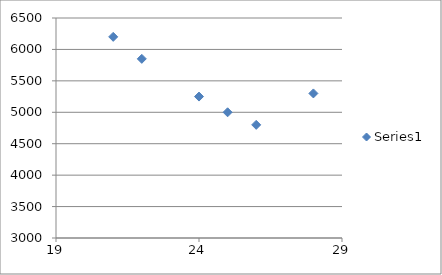
| Category | Series 0 |
|---|---|
| 28.0 | 5300 |
| 26.0 | 4800 |
| 25.0 | 5000 |
| 24.0 | 5250 |
| 22.0 | 5850 |
| 21.0 | 6200 |